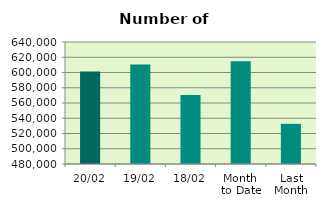
| Category | Series 0 |
|---|---|
| 20/02 | 601214 |
| 19/02 | 610572 |
| 18/02 | 570532 |
| Month 
to Date | 614794.571 |
| Last
Month | 532699.545 |